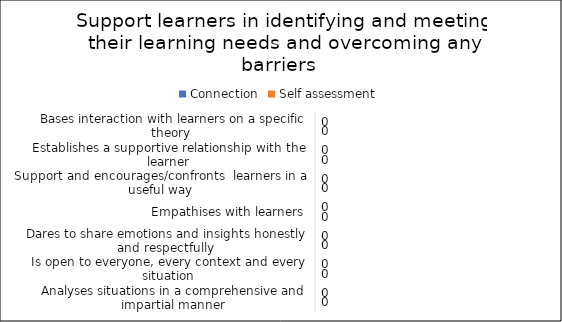
| Category | Connection | Self assessment |
|---|---|---|
| Bases interaction with learners on a specific theory  | 0 | 0 |
| Establishes a supportive relationship with the learner | 0 | 0 |
| Support and encourages/confronts  learners in a useful way | 0 | 0 |
| Empathises with learners | 0 | 0 |
| Dares to share emotions and insights honestly and respectfully | 0 | 0 |
| Is open to everyone, every context and every situation | 0 | 0 |
| Analyses situations in a comprehensive and impartial manner | 0 | 0 |